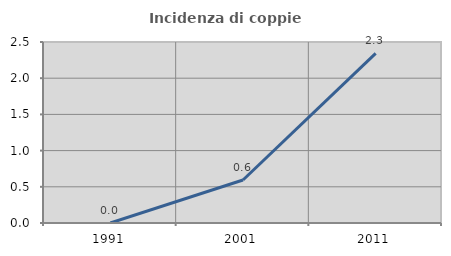
| Category | Incidenza di coppie miste |
|---|---|
| 1991.0 | 0 |
| 2001.0 | 0.593 |
| 2011.0 | 2.342 |